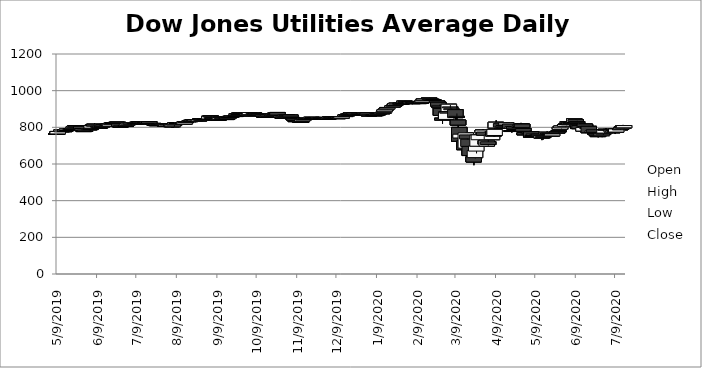
| Category | Open | High | Low | Close |
|---|---|---|---|---|
| 5/9/19 | 766.3 | 768.33 | 761.04 | 765.1 |
| 5/10/19 | 763.99 | 777.97 | 762.89 | 777.46 |
| 5/13/19 | 775.8 | 788.07 | 774.56 | 786.63 |
| 5/14/19 | 785.27 | 787.35 | 779.88 | 780.77 |
| 5/15/19 | 781.73 | 785.83 | 779.86 | 780.91 |
| 5/16/19 | 779.84 | 789.04 | 777.87 | 786.32 |
| 5/17/19 | 782.66 | 793.21 | 782.28 | 790.23 |
| 5/20/19 | 791.65 | 795.76 | 788.91 | 791.19 |
| 5/21/19 | 791.81 | 799.43 | 790.32 | 791.93 |
| 5/22/19 | 793.02 | 801.55 | 791.71 | 800.52 |
| 5/23/19 | 800.94 | 807.43 | 800.52 | 807.22 |
| 5/24/19 | 807.64 | 811.8 | 804.41 | 804.71 |
| 5/28/19 | 805.58 | 806.26 | 791.18 | 791.96 |
| 5/29/19 | 793.54 | 794.9 | 780.35 | 781.83 |
| 5/30/19 | 782.23 | 787.37 | 779.46 | 781.6 |
| 5/31/19 | 781.82 | 786.39 | 777.53 | 784.43 |
| 6/3/19 | 786.9 | 792.48 | 782.49 | 791.77 |
| 6/4/19 | 792.25 | 794.15 | 779.03 | 793.18 |
| 6/5/19 | 795.6 | 812.34 | 793.73 | 810.15 |
| 6/6/19 | 809.82 | 814.94 | 807.63 | 812.91 |
| 6/7/19 | 817.47 | 822.33 | 806.55 | 806.6 |
| 6/10/19 | 806.12 | 806.12 | 797.12 | 801.38 |
| 6/11/19 | 800.48 | 802.74 | 792.01 | 796.46 |
| 6/12/19 | 798.91 | 807.66 | 798.83 | 805.78 |
| 6/13/19 | 807.68 | 809.77 | 801.98 | 807.58 |
| 6/14/19 | 808.85 | 817.55 | 808.5 | 815.55 |
| 6/17/19 | 816.25 | 817.72 | 809.76 | 814.05 |
| 6/18/19 | 818.76 | 819.27 | 805.28 | 810.76 |
| 6/19/19 | 806.84 | 821.17 | 806.84 | 817.68 |
| 6/20/19 | 819.63 | 824.54 | 812.42 | 821.88 |
| 6/21/19 | 821.42 | 828.08 | 817.22 | 826.33 |
| 6/24/19 | 827.83 | 829.25 | 823.7 | 827.39 |
| 6/25/19 | 827.88 | 828 | 819.93 | 821.4 |
| 6/26/19 | 819.61 | 819.95 | 804.27 | 804.66 |
| 6/27/19 | 806.6 | 809.5 | 802.68 | 805.35 |
| 6/28/19 | 805.03 | 813.04 | 804.38 | 810.66 |
| 7/1/19 | 809.91 | 810.34 | 800.03 | 807.77 |
| 7/2/19 | 810.71 | 819.68 | 810.71 | 818 |
| 7/3/19 | 818.94 | 827.97 | 818.74 | 824.13 |
| 7/5/19 | 819.36 | 823.31 | 809.17 | 822.49 |
| 7/8/19 | 823.58 | 826.36 | 819.23 | 824.52 |
| 7/9/19 | 824.32 | 826.31 | 819.54 | 825.32 |
| 7/10/19 | 826.67 | 832.46 | 824.28 | 828.09 |
| 7/11/19 | 827.62 | 831.03 | 821.76 | 828.53 |
| 7/12/19 | 829.02 | 829.11 | 819.99 | 824.3 |
| 7/15/19 | 822.7 | 827.68 | 820.52 | 826.25 |
| 7/16/19 | 824.95 | 827.22 | 816.86 | 821.47 |
| 7/17/19 | 824.14 | 829.46 | 823.9 | 824.58 |
| 7/18/19 | 824.47 | 831.77 | 820.04 | 831.33 |
| 7/19/19 | 830.77 | 831.25 | 819.92 | 820.08 |
| 7/22/19 | 821.53 | 822.08 | 814.01 | 818.58 |
| 7/23/19 | 817.89 | 818.48 | 811.58 | 813.07 |
| 7/24/19 | 815.28 | 816.98 | 808.21 | 815.06 |
| 7/25/19 | 814.46 | 817.59 | 809.13 | 812.33 |
| 7/26/19 | 813.63 | 819.04 | 811.62 | 815.76 |
| 7/29/19 | 816.95 | 819.88 | 813.08 | 818.86 |
| 7/30/19 | 817.75 | 819.79 | 807.66 | 811.65 |
| 7/31/19 | 812.26 | 817.09 | 804.46 | 808.94 |
| 8/1/19 | 807.71 | 820.53 | 805.54 | 816.57 |
| 8/2/19 | 819.29 | 823.91 | 814.72 | 817.87 |
| 8/5/19 | 818.13 | 820.6 | 799.25 | 803.29 |
| 8/6/19 | 803.44 | 817.03 | 797.38 | 814.22 |
| 8/7/19 | 814.18 | 821.53 | 803.54 | 817.24 |
| 8/8/19 | 817.18 | 826.83 | 812.1 | 825.02 |
| 8/9/19 | 826.28 | 829.81 | 823.71 | 826.3 |
| 8/12/19 | 826.36 | 827.75 | 821.26 | 824.79 |
| 8/13/19 | 822.15 | 828.01 | 820.88 | 825.24 |
| 8/14/19 | 826.14 | 830.83 | 816.73 | 818.21 |
| 8/15/19 | 817.79 | 831.24 | 816.96 | 828.66 |
| 8/16/19 | 830.03 | 833.94 | 828.02 | 831.22 |
| 8/19/19 | 831.18 | 839.33 | 828.84 | 836.4 |
| 8/20/19 | 838.05 | 838.05 | 831.96 | 834.45 |
| 8/21/19 | 834.33 | 840.2 | 833.28 | 840.1 |
| 8/22/19 | 839.89 | 841.85 | 833.65 | 840.39 |
| 8/23/19 | 841.89 | 845.65 | 827.89 | 832.03 |
| 8/26/19 | 833.98 | 842.57 | 832.33 | 842.4 |
| 8/27/19 | 846.23 | 849.6 | 842.44 | 843.13 |
| 8/28/19 | 844.14 | 846.57 | 837.52 | 840.47 |
| 8/29/19 | 843.55 | 845.61 | 838.31 | 845.28 |
| 8/30/19 | 847.88 | 848.68 | 842.86 | 845.52 |
| 9/3/19 | 845.46 | 861.04 | 845.36 | 860.85 |
| 9/4/19 | 862.25 | 863.78 | 855.24 | 860.92 |
| 9/5/19 | 853.2 | 855.29 | 846.87 | 849.45 |
| 9/6/19 | 850.63 | 853.62 | 845.04 | 848.3 |
| 9/9/19 | 845.69 | 846.8 | 842.39 | 844.34 |
| 9/10/19 | 843.1 | 844.99 | 837.77 | 844.45 |
| 9/11/19 | 843.28 | 852.63 | 840.21 | 852.36 |
| 9/12/19 | 856.97 | 859.73 | 850.01 | 853.11 |
| 9/13/19 | 849.77 | 853.39 | 844.93 | 846.99 |
| 9/16/19 | 847.88 | 848.17 | 843.87 | 846.56 |
| 9/17/19 | 847.24 | 855.8 | 847.24 | 854.32 |
| 9/18/19 | 857.11 | 859.35 | 850.79 | 856.2 |
| 9/19/19 | 858.37 | 860.62 | 854.44 | 859.69 |
| 9/20/19 | 859.79 | 863.85 | 856.74 | 862.9 |
| 9/23/19 | 863.1 | 867.11 | 861.55 | 864.33 |
| 9/24/19 | 866.98 | 877.55 | 866 | 874.74 |
| 9/25/19 | 875.33 | 875.52 | 869.9 | 874.48 |
| 9/26/19 | 876.39 | 881.56 | 874.84 | 879.11 |
| 9/27/19 | 879.6 | 880.05 | 872.06 | 876.46 |
| 9/30/19 | 877.55 | 882.37 | 875.93 | 878.66 |
| 10/1/19 | 876.97 | 877.99 | 871.61 | 874.26 |
| 10/2/19 | 873.56 | 874.08 | 862.29 | 864.1 |
| 10/3/19 | 866.12 | 867.59 | 860.9 | 867.45 |
| 10/4/19 | 869.25 | 881.34 | 867.35 | 880.5 |
| 10/7/19 | 879.02 | 879.69 | 874.13 | 876.22 |
| 10/8/19 | 875.34 | 875.52 | 868.04 | 868.17 |
| 10/9/19 | 871.41 | 876.86 | 870.03 | 873.47 |
| 10/10/19 | 870.83 | 874.43 | 865.6 | 872.2 |
| 10/11/19 | 871.7 | 872.56 | 865.13 | 866.66 |
| 10/14/19 | 867.96 | 868.26 | 856.89 | 859.8 |
| 10/15/19 | 860.47 | 862.66 | 854.95 | 857.1 |
| 10/16/19 | 856.43 | 859.83 | 852.69 | 859.4 |
| 10/17/19 | 858.56 | 864.31 | 857.54 | 862.34 |
| 10/18/19 | 862.48 | 867.62 | 859.07 | 866.01 |
| 10/21/19 | 865.7 | 868.62 | 862.46 | 868.22 |
| 10/22/19 | 869.36 | 877.32 | 868.49 | 873.27 |
| 10/23/19 | 874.39 | 879.08 | 873.19 | 876.46 |
| 10/24/19 | 876.57 | 881.08 | 875.54 | 879.82 |
| 10/25/19 | 881.15 | 881.42 | 863.94 | 866.92 |
| 10/28/19 | 864.75 | 864.75 | 853.61 | 854.55 |
| 10/29/19 | 853.85 | 856.85 | 851.43 | 855.03 |
| 10/30/19 | 854.87 | 862.15 | 853.17 | 860.1 |
| 10/31/19 | 862.23 | 867.55 | 859.14 | 867.52 |
| 11/1/19 | 868.59 | 872.19 | 865.56 | 867.83 |
| 11/4/19 | 867.23 | 867.23 | 853.86 | 856.93 |
| 11/5/19 | 853.99 | 854.3 | 844.73 | 848.26 |
| 11/6/19 | 849.95 | 854.73 | 848.74 | 850.36 |
| 11/7/19 | 846.44 | 847.15 | 833.23 | 838.34 |
| 11/8/19 | 836.52 | 839.51 | 831.34 | 835.3 |
| 11/11/19 | 835.13 | 836.65 | 829.16 | 829.75 |
| 11/12/19 | 830.13 | 833.8 | 828.89 | 832.2 |
| 11/13/19 | 834.35 | 845.9 | 833.79 | 844.31 |
| 11/14/19 | 844.25 | 850.38 | 843.07 | 845.53 |
| 11/15/19 | 845.05 | 848.47 | 842.57 | 848.47 |
| 11/18/19 | 849.9 | 856.63 | 849.12 | 850.54 |
| 11/19/19 | 847.6 | 852.53 | 844.29 | 848.31 |
| 11/20/19 | 848.43 | 855.84 | 847.56 | 855.01 |
| 11/21/19 | 853.83 | 855.09 | 848.38 | 851.37 |
| 11/22/19 | 853.45 | 853.91 | 845.5 | 851.25 |
| 11/25/19 | 851.33 | 854.21 | 846.43 | 848.88 |
| 11/26/19 | 849.43 | 853.04 | 848.54 | 852.18 |
| 11/27/19 | 852.41 | 853.64 | 848.96 | 852.87 |
| 11/29/19 | 854.37 | 858.19 | 850.89 | 851.72 |
| 12/2/19 | 848.93 | 849.64 | 844.09 | 845.88 |
| 12/3/19 | 847.65 | 851.72 | 847.65 | 850.67 |
| 12/4/19 | 848.74 | 856.49 | 848.39 | 855.8 |
| 12/5/19 | 854.84 | 857.17 | 851.95 | 856.86 |
| 12/6/19 | 856.1 | 859.56 | 854.78 | 855.04 |
| 12/9/19 | 855.52 | 855.94 | 850.5 | 851.78 |
| 12/10/19 | 852.47 | 854.86 | 850.59 | 852.58 |
| 12/11/19 | 851.16 | 855.26 | 849.57 | 855.01 |
| 12/12/19 | 854.33 | 856.63 | 846.56 | 849.68 |
| 12/13/19 | 848.94 | 858.22 | 846.22 | 856.85 |
| 12/16/19 | 858.76 | 867.33 | 856.64 | 867.33 |
| 12/17/19 | 867.58 | 874.04 | 866.48 | 867.99 |
| 12/18/19 | 869.42 | 872.99 | 864.04 | 871.9 |
| 12/19/19 | 871.72 | 873.78 | 867.59 | 871.87 |
| 12/20/19 | 877.02 | 882.61 | 871.57 | 878.26 |
| 12/23/19 | 878.94 | 880.41 | 868.2 | 870.15 |
| 12/24/19 | 870.28 | 872.1 | 867.06 | 871.56 |
| 12/26/19 | 872.32 | 874.63 | 871.03 | 874.33 |
| 12/27/19 | 873.99 | 876.26 | 872.33 | 876.22 |
| 12/30/19 | 873.67 | 875.93 | 871.15 | 875.41 |
| 12/31/19 | 876.08 | 879.58 | 873.87 | 879.17 |
| 1/2/20 | 879.22 | 879.76 | 863.67 | 866.82 |
| 1/3/20 | 865.85 | 872.43 | 865.69 | 867.44 |
| 1/6/20 | 867.83 | 872.1 | 866.48 | 870.03 |
| 1/7/20 | 868.48 | 869.34 | 864.13 | 868.6 |
| 1/8/20 | 869.12 | 872.93 | 867.3 | 868.91 |
| 1/9/20 | 867.63 | 874.2 | 867.38 | 872.65 |
| 1/10/20 | 874.34 | 877.35 | 873.1 | 874.1 |
| 1/13/20 | 873.84 | 882.12 | 873.73 | 879.69 |
| 1/14/20 | 879.51 | 882.67 | 876.12 | 882.07 |
| 1/15/20 | 885.27 | 896.97 | 885.07 | 895.82 |
| 1/16/20 | 895.9 | 901.6 | 895.76 | 900.42 |
| 1/17/20 | 900.98 | 908.98 | 898.93 | 908.3 |
| 1/21/20 | 908.93 | 917.95 | 906.34 | 917.1 |
| 1/22/20 | 920.52 | 923.24 | 918.77 | 919.96 |
| 1/23/20 | 919.23 | 928.77 | 919.17 | 928.57 |
| 1/24/20 | 927.59 | 934.46 | 924.5 | 931.94 |
| 1/27/20 | 931.04 | 937.67 | 927.46 | 929.65 |
| 1/28/20 | 930.64 | 937.52 | 928.15 | 933.09 |
| 1/29/20 | 934.05 | 936.54 | 930.17 | 935.1 |
| 1/30/20 | 934 | 943.97 | 931.95 | 943.03 |
| 1/31/20 | 941.83 | 944.59 | 933.84 | 938.57 |
| 2/3/20 | 940.02 | 942.38 | 937.77 | 940.67 |
| 2/4/20 | 939.85 | 943.13 | 929.65 | 930.34 |
| 2/5/20 | 929.84 | 937.85 | 926.44 | 934.85 |
| 2/6/20 | 934.9 | 939.72 | 932.49 | 935.16 |
| 2/7/20 | 936.84 | 938.35 | 931.47 | 931.83 |
| 2/10/20 | 933.38 | 935.09 | 929.6 | 934.97 |
| 2/11/20 | 937.74 | 941.65 | 936.95 | 938.48 |
| 2/12/20 | 936.28 | 941.4 | 934.21 | 938.12 |
| 2/13/20 | 938.23 | 948.43 | 938.06 | 947.38 |
| 2/14/20 | 948.85 | 956.35 | 948.16 | 955.35 |
| 2/18/20 | 958.28 | 963.8 | 955.61 | 960.89 |
| 2/19/20 | 954.97 | 958.07 | 949.87 | 950.01 |
| 2/20/20 | 949.25 | 952.98 | 945.15 | 952.4 |
| 2/21/20 | 951.78 | 954.24 | 947.56 | 948.74 |
| 2/24/20 | 943.92 | 948.69 | 935.91 | 935.91 |
| 2/25/20 | 936.9 | 938.62 | 914.42 | 915.77 |
| 2/26/20 | 916.11 | 924.2 | 906.8 | 906.97 |
| 2/27/20 | 903.4 | 907.82 | 865.39 | 865.47 |
| 2/28/20 | 849.89 | 849.89 | 818.11 | 839.96 |
| 3/2/20 | 843.09 | 887.01 | 843.02 | 886.52 |
| 3/3/20 | 886.47 | 905.51 | 874.08 | 877.25 |
| 3/4/20 | 886.19 | 926.48 | 886.19 | 926.14 |
| 3/5/20 | 911.65 | 921.61 | 898.4 | 908.14 |
| 3/6/20 | 899.79 | 904.79 | 870.52 | 901.7 |
| 3/9/20 | 896.54 | 896.54 | 840.13 | 852.8 |
| 3/10/20 | 859.08 | 875.78 | 820.82 | 860.03 |
| 3/11/20 | 839.96 | 839.96 | 801.15 | 812.44 |
| 3/12/20 | 799.81 | 799.81 | 721.61 | 723.88 |
| 3/13/20 | 741.78 | 763.11 | 706.59 | 762.6 |
| 3/16/20 | 727.21 | 750.37 | 675.8 | 678.03 |
| 3/17/20 | 686.45 | 773.49 | 686.45 | 769.69 |
| 3/18/20 | 758.77 | 758.77 | 696.63 | 737.25 |
| 3/19/20 | 735.34 | 735.34 | 692.18 | 695.92 |
| 3/20/20 | 695.97 | 696.63 | 640.76 | 646.13 |
| 3/23/20 | 640.13 | 640.13 | 593.52 | 610.89 |
| 3/24/20 | 634.75 | 677.53 | 629.9 | 673.89 |
| 3/25/20 | 670.41 | 726.07 | 657.29 | 697.96 |
| 3/26/20 | 697.02 | 765.6 | 695.72 | 757.92 |
| 3/27/20 | 732.33 | 786.14 | 732.33 | 758.93 |
| 3/30/20 | 770.11 | 789.58 | 763.01 | 785.14 |
| 3/31/20 | 774.45 | 776.58 | 753.28 | 756.16 |
| 4/1/20 | 727.84 | 735.32 | 695 | 708.04 |
| 4/2/20 | 697.9 | 734 | 697.9 | 729.36 |
| 4/3/20 | 721.76 | 730.67 | 700.07 | 706.01 |
| 4/6/20 | 732.69 | 766.38 | 731.81 | 758.06 |
| 4/7/20 | 779.02 | 779.91 | 749 | 750.81 |
| 4/8/20 | 755.52 | 794.84 | 747.29 | 789.15 |
| 4/9/20 | 796.85 | 837.96 | 796.85 | 827.83 |
| 4/13/20 | 820.91 | 821.71 | 794.66 | 801.39 |
| 4/14/20 | 820.79 | 826.33 | 811.46 | 825.1 |
| 4/15/20 | 809.89 | 810.05 | 794.3 | 796.95 |
| 4/16/20 | 802.69 | 806.44 | 792.14 | 797.54 |
| 4/17/20 | 813.06 | 827.65 | 803.87 | 823.98 |
| 4/20/20 | 817.94 | 817.94 | 793.77 | 794.85 |
| 4/21/20 | 782.64 | 791.65 | 771.55 | 780.99 |
| 4/22/20 | 794.36 | 809.62 | 790.91 | 804.41 |
| 4/23/20 | 804.95 | 809.19 | 789.34 | 790.75 |
| 4/24/20 | 792.32 | 799.08 | 783.68 | 795.09 |
| 4/27/20 | 799.12 | 810.8 | 799.12 | 805.8 |
| 4/28/20 | 817.17 | 824.29 | 801.46 | 804.93 |
| 4/29/20 | 817.97 | 817.97 | 794.85 | 798.48 |
| 4/30/20 | 793.51 | 793.51 | 772.49 | 778.29 |
| 5/1/20 | 771.04 | 771.09 | 755.75 | 759.08 |
| 5/4/20 | 761.94 | 769.95 | 751.46 | 767.37 |
| 5/5/20 | 769.35 | 783.13 | 768.59 | 773.21 |
| 5/6/20 | 775.98 | 776.12 | 745.3 | 746.35 |
| 5/7/20 | 755.16 | 763.58 | 750.33 | 751.97 |
| 5/8/20 | 759.87 | 766.46 | 755.59 | 764.11 |
| 5/11/20 | 757.93 | 763.64 | 748.28 | 761.83 |
| 5/12/20 | 762.9 | 765.56 | 751.88 | 753.3 |
| 5/13/20 | 750.4 | 752.57 | 738.58 | 747.54 |
| 5/14/20 | 741.09 | 756.83 | 730.31 | 754.78 |
| 5/15/20 | 749.39 | 749.51 | 733.96 | 744.49 |
| 5/18/20 | 762.72 | 777.39 | 762.57 | 773.18 |
| 5/19/20 | 769.43 | 771.69 | 761.35 | 761.4 |
| 5/20/20 | 767.26 | 772.01 | 758.96 | 761.59 |
| 5/21/20 | 760.36 | 765.22 | 752.1 | 754.02 |
| 5/22/20 | 753.25 | 764.28 | 751.07 | 763.93 |
| 5/26/20 | 775.52 | 782.86 | 767.37 | 769.03 |
| 5/27/20 | 781.57 | 783.73 | 766.86 | 777.69 |
| 5/28/20 | 789.03 | 803.5 | 787.54 | 800.8 |
| 5/29/20 | 797.46 | 809.74 | 793.92 | 806.92 |
| 6/1/20 | 805.4 | 820.65 | 800.89 | 815.33 |
| 6/2/20 | 818.8 | 822.05 | 810.28 | 820.4 |
| 6/3/20 | 825.25 | 835.84 | 823.97 | 831.27 |
| 6/4/20 | 824.9 | 827.49 | 804.17 | 814.06 |
| 6/5/20 | 820.62 | 841.16 | 819.36 | 826.52 |
| 6/8/20 | 826.31 | 849.44 | 821.19 | 847.26 |
| 6/9/20 | 842.26 | 842.26 | 822.42 | 830.34 |
| 6/10/20 | 830.98 | 836.05 | 823.43 | 824.72 |
| 6/11/20 | 812.02 | 812.02 | 788.16 | 793.23 |
| 6/12/20 | 809.44 | 810.19 | 782.86 | 793 |
| 6/15/20 | 779.59 | 805.1 | 772.71 | 799.76 |
| 6/16/20 | 818.1 | 822.57 | 798.07 | 802.37 |
| 6/17/20 | 805.79 | 806.29 | 792.79 | 800.36 |
| 6/18/20 | 795.63 | 802.2 | 791.32 | 798.74 |
| 6/19/20 | 805.65 | 808.47 | 770.61 | 770.61 |
| 6/22/20 | 771.58 | 785.06 | 766.97 | 780.42 |
| 6/23/20 | 786.59 | 788.56 | 770.92 | 773.47 |
| 6/24/20 | 766.91 | 772.07 | 759 | 767.6 |
| 6/25/20 | 765.24 | 765.24 | 748.23 | 757.34 |
| 6/26/20 | 756.59 | 765.41 | 745.4 | 749.4 |
| 6/29/20 | 754.56 | 764.55 | 746.62 | 764.39 |
| 6/30/20 | 764.93 | 771.22 | 759.17 | 767.5 |
| 7/1/20 | 768.61 | 788.48 | 766.94 | 785.15 |
| 7/2/20 | 789.68 | 795.66 | 784.79 | 786.89 |
| 7/6/20 | 788.93 | 794.55 | 773.27 | 779.03 |
| 7/7/20 | 771.67 | 778.57 | 768.37 | 775.59 |
| 7/8/20 | 773.98 | 785.53 | 773.74 | 783.15 |
| 7/9/20 | 778.94 | 779.35 | 763.5 | 774.23 |
| 7/10/20 | 774.18 | 793.17 | 773.96 | 791.35 |
| 7/13/20 | 791.47 | 799.02 | 787.83 | 791.24 |
| 7/14/20 | 791.47 | 804.44 | 791.19 | 799.91 |
| 7/15/20 | 806.87 | 813.11 | 795.28 | 796.47 |
| 7/16/20 | 797.46 | 811.53 | 795.03 | 809.52 |